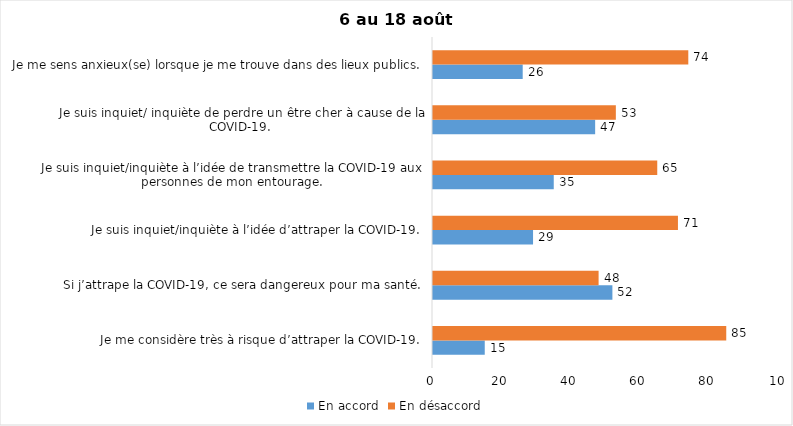
| Category | En accord | En désaccord |
|---|---|---|
| Je me considère très à risque d’attraper la COVID-19. | 15 | 85 |
| Si j’attrape la COVID-19, ce sera dangereux pour ma santé. | 52 | 48 |
| Je suis inquiet/inquiète à l’idée d’attraper la COVID-19. | 29 | 71 |
| Je suis inquiet/inquiète à l’idée de transmettre la COVID-19 aux personnes de mon entourage. | 35 | 65 |
| Je suis inquiet/ inquiète de perdre un être cher à cause de la COVID-19. | 47 | 53 |
| Je me sens anxieux(se) lorsque je me trouve dans des lieux publics. | 26 | 74 |